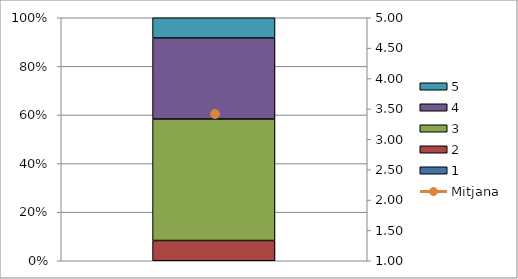
| Category | 1 | 2 | 3 | 4 | 5 |
|---|---|---|---|---|---|
| 0 | 0 | 1 | 6 | 4 | 1 |